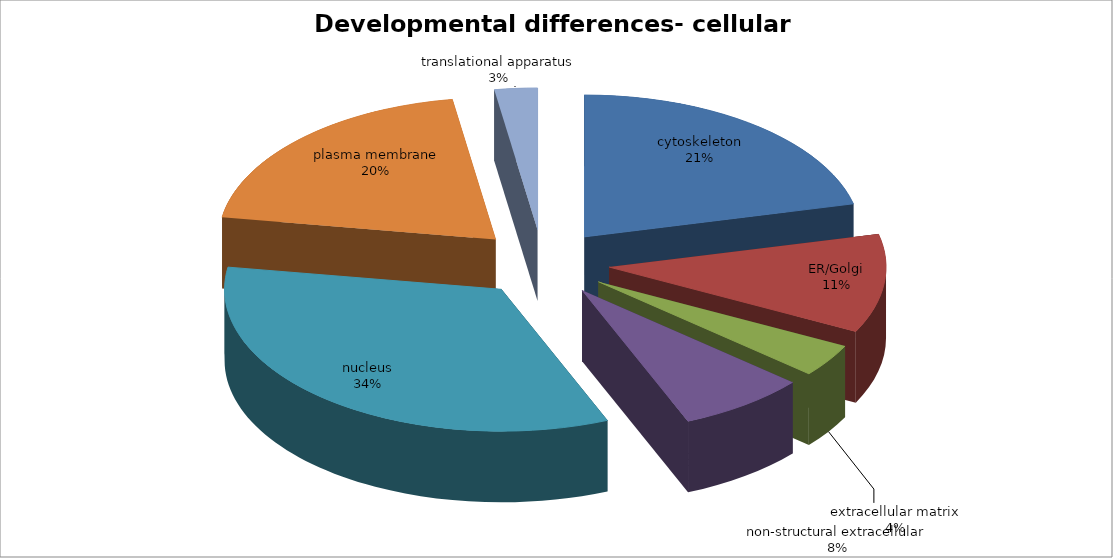
| Category | Series 0 |
|---|---|
| cytoskeleton | 17 |
| ER/Golgi | 9 |
| extracellular matrix | 3 |
| non-structural extracellular | 6 |
| nucleus | 27 |
| plasma membrane | 16 |
| translational apparatus | 2 |